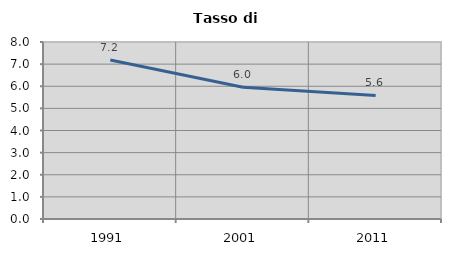
| Category | Tasso di disoccupazione   |
|---|---|
| 1991.0 | 7.186 |
| 2001.0 | 5.952 |
| 2011.0 | 5.587 |